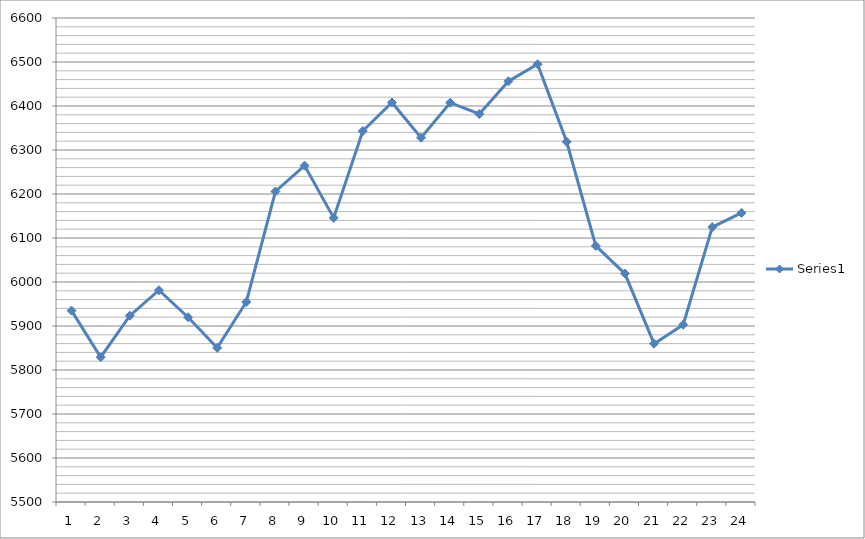
| Category | Series 0 |
|---|---|
| 0 | 5934.96 |
| 1 | 5829.12 |
| 2 | 5923.44 |
| 3 | 5981.28 |
| 4 | 5919.84 |
| 5 | 5850.24 |
| 6 | 5954.64 |
| 7 | 6205.68 |
| 8 | 6264.48 |
| 9 | 6145.68 |
| 10 | 6343.2 |
| 11 | 6408 |
| 12 | 6327.84 |
| 13 | 6407.52 |
| 14 | 6381.84 |
| 15 | 6456.24 |
| 16 | 6494.88 |
| 17 | 6318.72 |
| 18 | 6082.08 |
| 19 | 6019.2 |
| 20 | 5859.84 |
| 21 | 5902.8 |
| 22 | 6124.8 |
| 23 | 6156.96 |